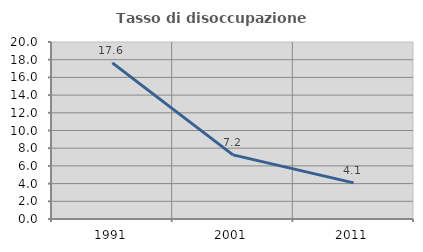
| Category | Tasso di disoccupazione giovanile  |
|---|---|
| 1991.0 | 17.647 |
| 2001.0 | 7.246 |
| 2011.0 | 4.082 |